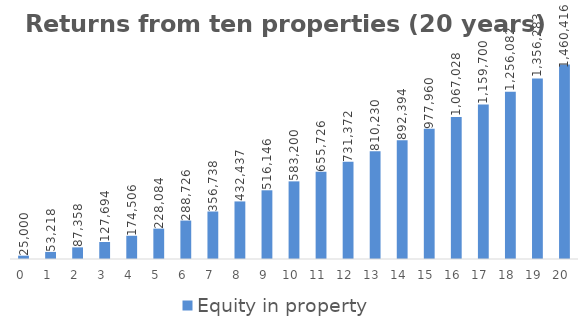
| Category | Equity in property  | Total equity  |
|---|---|---|
| 0.0 | 25000 | 25000 |
| 1.0 | 53218.328 | 53218.328 |
| 2.0 | 87358.282 | 87358.282 |
| 3.0 | 127693.607 | 127693.607 |
| 4.0 | 174505.593 | 174505.593 |
| 5.0 | 228083.697 | 228083.697 |
| 6.0 | 288725.785 | 288725.785 |
| 7.0 | 356738.392 | 356738.392 |
| 8.0 | 432436.982 | 432436.982 |
| 9.0 | 516146.223 | 516146.223 |
| 10.0 | 583200.266 | 583200.266 |
| 11.0 | 655725.702 | 655725.702 |
| 12.0 | 731372.229 | 731372.229 |
| 13.0 | 810230.474 | 810230.474 |
| 14.0 | 892394.215 | 892394.215 |
| 15.0 | 977960.095 | 977960.095 |
| 16.0 | 1067027.708 | 1067027.708 |
| 17.0 | 1159699.699 | 1159699.699 |
| 18.0 | 1256081.859 | 1256081.859 |
| 19.0 | 1356283.228 | 1356283.228 |
| 20.0 | 1460416.2 | 1460416.2 |